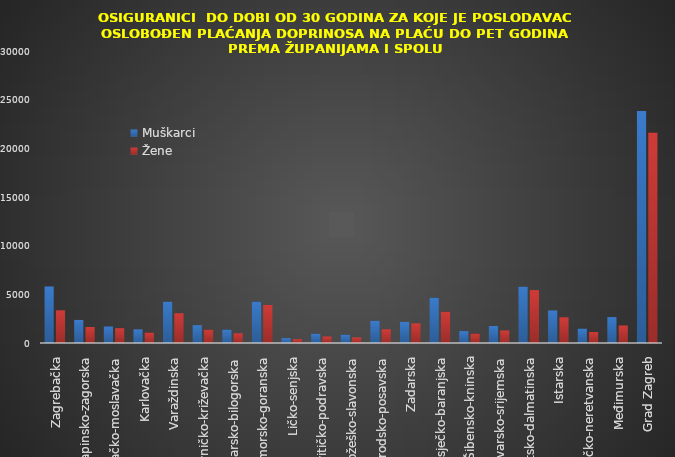
| Category | Muškarci | Žene |
|---|---|---|
| Zagrebačka | 5808 | 3356 |
| Krapinsko-zagorska | 2374 | 1647 |
| Sisačko-moslavačka | 1697 | 1521 |
| Karlovačka | 1400 | 1075 |
| Varaždinska | 4246 | 3064 |
| Koprivničko-križevačka | 1828 | 1368 |
| Bjelovarsko-bilogorska | 1384 | 995 |
| Primorsko-goranska | 4255 | 3907 |
| Ličko-senjska | 500 | 400 |
| Virovitičko-podravska | 944 | 677 |
| Požeško-slavonska | 862 | 578 |
| Brodsko-posavska | 2286 | 1410 |
| Zadarska | 2175 | 2021 |
| Osječko-baranjska | 4658 | 3225 |
| Šibensko-kninska | 1222 | 973 |
| Vukovarsko-srijemska | 1746 | 1292 |
| Splitsko-dalmatinska | 5794 | 5434 |
| Istarska | 3345 | 2639 |
| Dubrovačko-neretvanska | 1489 | 1131 |
| Međimurska | 2663 | 1800 |
| Grad Zagreb | 23842 | 21614 |